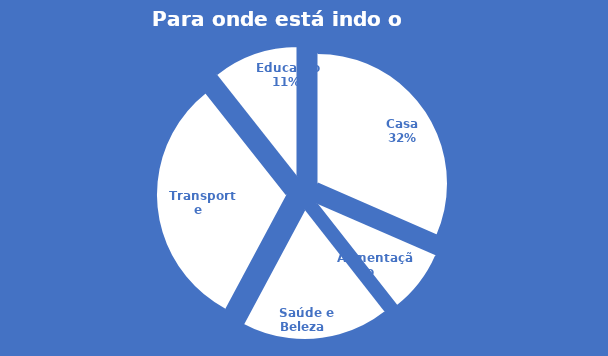
| Category | Series 0 |
|---|---|
| Casa | 1200 |
| Alimentação | 300 |
| Saúde e Beleza | 700 |
| Transporte | 1200 |
| Educação | 405 |